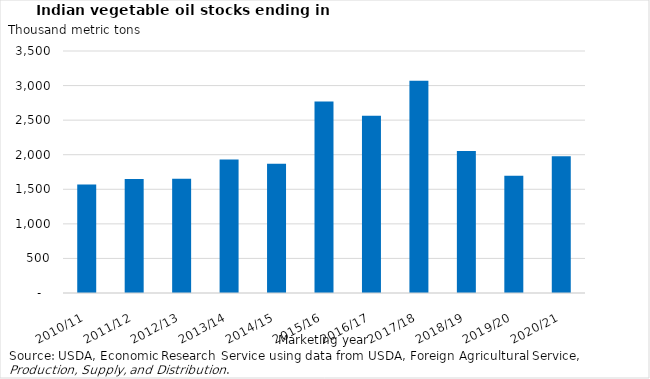
| Category | Stocks |
|---|---|
| 2010/11 | 1568 |
| 2011/12 | 1647 |
| 2012/13 | 1654 |
| 2013/14 | 1929 |
| 2014/15 | 1870 |
| 2015/16 | 2768 |
| 2016/17 | 2565 |
| 2017/18 | 3070 |
| 2018/19 | 2055 |
| 2019/20 | 1694 |
| 2020/21 | 1977 |